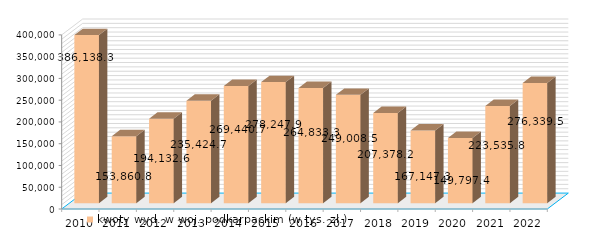
| Category | kwoty wyd. w woj. podkarpackim (w tys. zł.) |
|---|---|
| 2010.0 | 386138.3 |
| 2011.0 | 153860.8 |
| 2012.0 | 194132.6 |
| 2013.0 | 235424.7 |
| 2014.0 | 269440.7 |
| 2015.0 | 278247.9 |
| 2016.0 | 264833.3 |
| 2017.0 | 249008.5 |
| 2018.0 | 207378.2 |
| 2019.0 | 167147.3 |
| 2020.0 | 149797.4 |
| 2021.0 | 223535.811 |
| 2022.0 | 276339.488 |